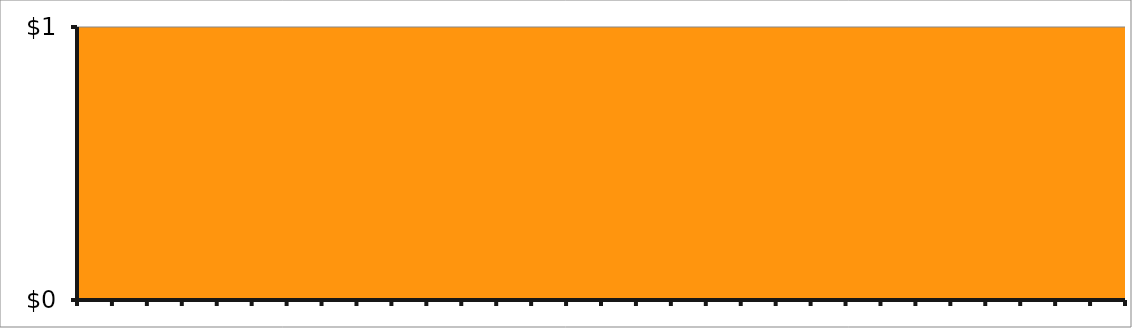
| Category | Untitled 1 |
|---|---|
| Beginning of day balance | 0 |
|  | 0 |
|  | 0 |
|  | 0 |
|  | 0 |
|  | 0 |
|  | 0 |
|  | 0 |
|  | 0 |
|  | 0 |
|  | 0 |
|  | 0 |
|  | 0 |
|  | 0 |
|  | 0 |
|  | 0 |
|  | 0 |
|  | 0 |
|  | 0 |
|  | 0 |
|  | 0 |
|  | 0 |
|  | 0 |
|  | 0 |
|  | 0 |
|  | 0 |
|  | 0 |
| Days traded this month | 0 |
|  | 0 |
|  | 0 |
| 0 | 0 |